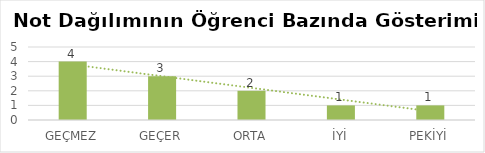
| Category | Series 2 |
|---|---|
| GEÇMEZ | 4 |
| GEÇER | 3 |
| ORTA | 2 |
| İYİ | 1 |
| PEKİYİ | 1 |